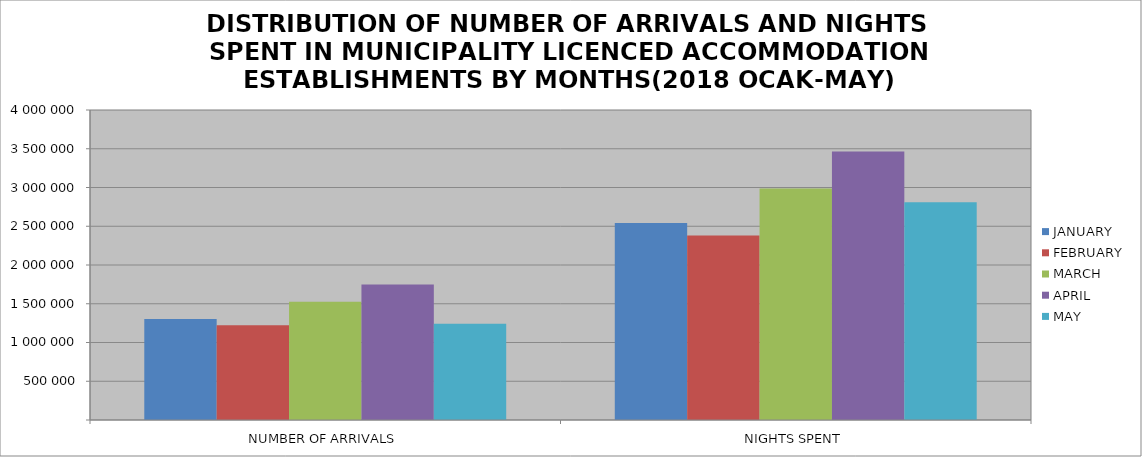
| Category | JANUARY | FEBRUARY | MARCH | APRIL | MAY |
|---|---|---|---|---|---|
| NUMBER OF ARRIVALS | 1303353 | 1223475 | 1526172 | 1749085 | 1240889 |
| NIGHTS SPENT | 2542103 | 2381300 | 2986820 | 3463261 | 2810808 |